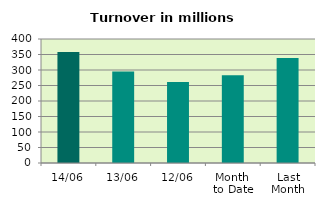
| Category | Series 0 |
|---|---|
| 14/06 | 358.233 |
| 13/06 | 294.995 |
| 12/06 | 261.024 |
| Month 
to Date | 283.379 |
| Last
Month | 338.969 |